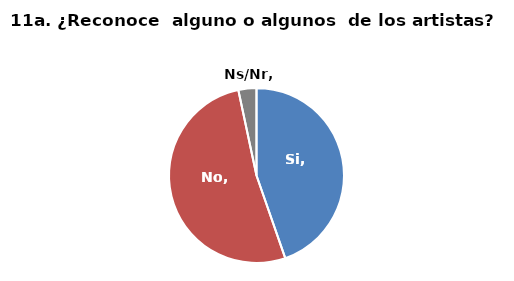
| Category | Series 0 |
|---|---|
| Si | 0.447 |
| No | 0.52 |
| Ns/Nr | 0.033 |